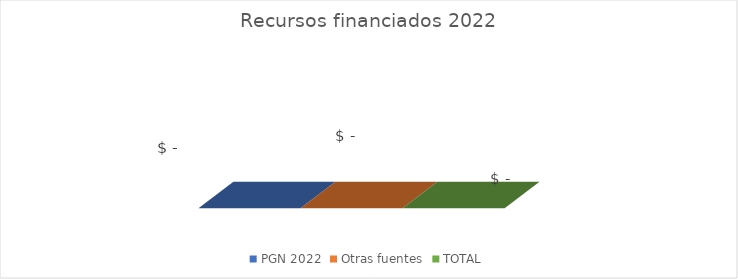
| Category | PGN 2022 | Otras fuentes | TOTAL |
|---|---|---|---|
|  | 0 | 0 | 0 |